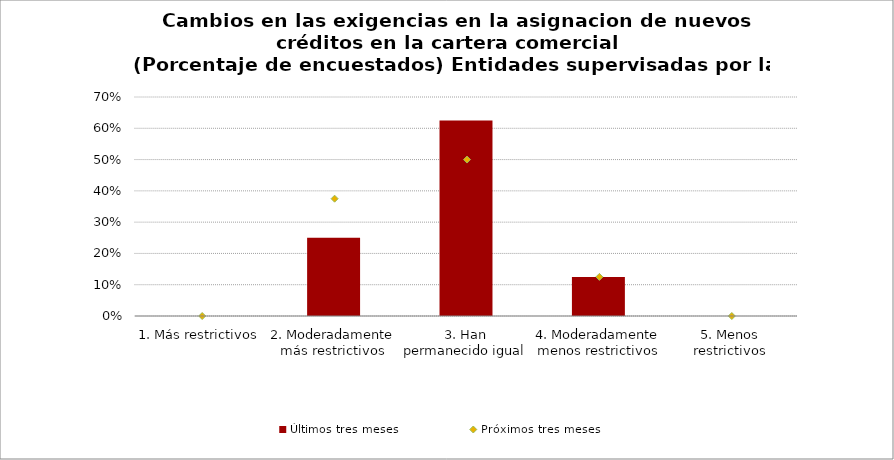
| Category | Últimos tres meses |
|---|---|
| 1. Más restrictivos | 0 |
| 2. Moderadamente más restrictivos | 0.25 |
| 3. Han permanecido igual | 0.625 |
| 4. Moderadamente menos restrictivos | 0.125 |
| 5. Menos restrictivos | 0 |